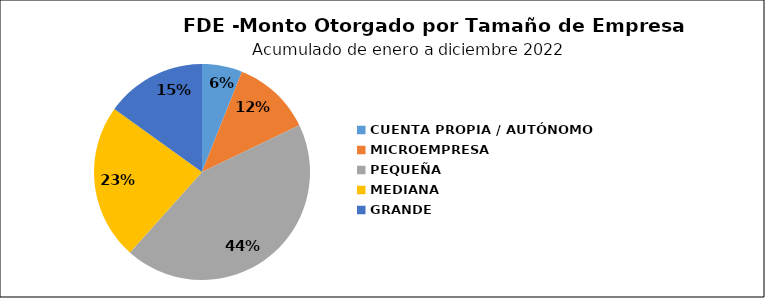
| Category | Monto | Créditos |
|---|---|---|
| CUENTA PROPIA / AUTÓNOMO | 0.928 | 69 |
| MICROEMPRESA | 1.822 | 114 |
| PEQUEÑA  | 6.737 | 51 |
| MEDIANA | 3.587 | 6 |
| GRANDE | 2.32 | 2 |